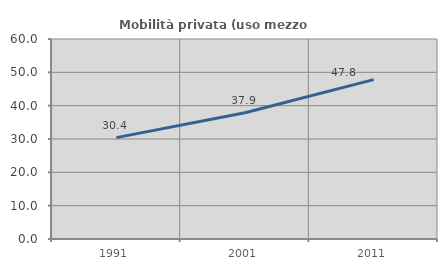
| Category | Mobilità privata (uso mezzo privato) |
|---|---|
| 1991.0 | 30.405 |
| 2001.0 | 37.89 |
| 2011.0 | 47.802 |